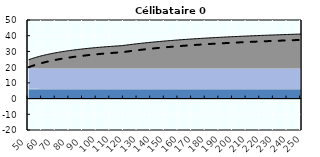
| Category | Coin fiscal moyen (somme des composantes) | Taux moyen d'imposition net en % du salaire brut |
|---|---|---|
| 50.0 | 24.742 | 19.963 |
| 51.0 | 25.045 | 20.286 |
| 52.0 | 25.337 | 20.596 |
| 53.0 | 25.618 | 20.895 |
| 54.0 | 25.889 | 21.183 |
| 55.0 | 26.149 | 21.46 |
| 56.0 | 26.401 | 21.727 |
| 57.0 | 26.643 | 21.985 |
| 58.0 | 26.878 | 22.234 |
| 59.0 | 27.104 | 22.475 |
| 60.0 | 27.323 | 22.708 |
| 61.0 | 27.534 | 22.933 |
| 62.0 | 27.739 | 23.15 |
| 63.0 | 27.937 | 23.361 |
| 64.0 | 28.129 | 23.565 |
| 65.0 | 28.315 | 23.763 |
| 66.0 | 28.496 | 23.955 |
| 67.0 | 28.671 | 24.142 |
| 68.0 | 28.841 | 24.322 |
| 69.0 | 29.006 | 24.498 |
| 70.0 | 29.166 | 24.668 |
| 71.0 | 29.322 | 24.834 |
| 72.0 | 29.473 | 24.995 |
| 73.0 | 29.621 | 25.152 |
| 74.0 | 29.764 | 25.304 |
| 75.0 | 29.904 | 25.452 |
| 76.0 | 30.039 | 25.597 |
| 77.0 | 30.172 | 25.738 |
| 78.0 | 30.301 | 25.875 |
| 79.0 | 30.426 | 26.008 |
| 80.0 | 30.549 | 26.139 |
| 81.0 | 30.668 | 26.266 |
| 82.0 | 30.785 | 26.39 |
| 83.0 | 30.899 | 26.511 |
| 84.0 | 31.01 | 26.629 |
| 85.0 | 31.118 | 26.744 |
| 86.0 | 31.224 | 26.857 |
| 87.0 | 31.328 | 26.967 |
| 88.0 | 31.429 | 27.074 |
| 89.0 | 31.528 | 27.18 |
| 90.0 | 31.624 | 27.282 |
| 91.0 | 31.719 | 27.383 |
| 92.0 | 31.811 | 27.481 |
| 93.0 | 31.902 | 27.578 |
| 94.0 | 31.99 | 27.672 |
| 95.0 | 32.077 | 27.764 |
| 96.0 | 32.162 | 27.854 |
| 97.0 | 32.245 | 27.943 |
| 98.0 | 32.327 | 28.029 |
| 99.0 | 32.406 | 28.114 |
| 100.0 | 32.485 | 28.197 |
| 101.0 | 32.561 | 28.279 |
| 102.0 | 32.636 | 28.359 |
| 103.0 | 32.71 | 28.437 |
| 104.0 | 32.782 | 28.514 |
| 105.0 | 32.853 | 28.589 |
| 106.0 | 32.923 | 28.663 |
| 107.0 | 32.991 | 28.736 |
| 108.0 | 33.058 | 28.807 |
| 109.0 | 33.124 | 28.877 |
| 110.0 | 33.189 | 28.946 |
| 111.0 | 33.252 | 29.013 |
| 112.0 | 33.314 | 29.08 |
| 113.0 | 33.375 | 29.145 |
| 114.0 | 33.435 | 29.209 |
| 115.0 | 33.495 | 29.271 |
| 116.0 | 33.553 | 29.333 |
| 117.0 | 33.61 | 29.394 |
| 118.0 | 33.666 | 29.453 |
| 119.0 | 33.744 | 29.537 |
| 120.0 | 33.861 | 29.661 |
| 121.0 | 33.975 | 29.783 |
| 122.0 | 34.088 | 29.902 |
| 123.0 | 34.199 | 30.02 |
| 124.0 | 34.308 | 30.136 |
| 125.0 | 34.415 | 30.25 |
| 126.0 | 34.521 | 30.363 |
| 127.0 | 34.625 | 30.473 |
| 128.0 | 34.727 | 30.582 |
| 129.0 | 34.828 | 30.689 |
| 130.0 | 34.927 | 30.795 |
| 131.0 | 35.024 | 30.898 |
| 132.0 | 35.121 | 31.001 |
| 133.0 | 35.215 | 31.101 |
| 134.0 | 35.309 | 31.201 |
| 135.0 | 35.401 | 31.299 |
| 136.0 | 35.491 | 31.395 |
| 137.0 | 35.58 | 31.49 |
| 138.0 | 35.668 | 31.583 |
| 139.0 | 35.755 | 31.676 |
| 140.0 | 35.841 | 31.766 |
| 141.0 | 35.925 | 31.856 |
| 142.0 | 36.008 | 31.944 |
| 143.0 | 36.09 | 32.031 |
| 144.0 | 36.171 | 32.117 |
| 145.0 | 36.25 | 32.202 |
| 146.0 | 36.329 | 32.286 |
| 147.0 | 36.406 | 32.368 |
| 148.0 | 36.483 | 32.449 |
| 149.0 | 36.558 | 32.53 |
| 150.0 | 36.632 | 32.609 |
| 151.0 | 36.706 | 32.687 |
| 152.0 | 36.778 | 32.764 |
| 153.0 | 36.85 | 32.84 |
| 154.0 | 36.92 | 32.915 |
| 155.0 | 36.99 | 32.989 |
| 156.0 | 37.059 | 33.062 |
| 157.0 | 37.127 | 33.134 |
| 158.0 | 37.194 | 33.206 |
| 159.0 | 37.26 | 33.276 |
| 160.0 | 37.325 | 33.346 |
| 161.0 | 37.39 | 33.414 |
| 162.0 | 37.454 | 33.482 |
| 163.0 | 37.517 | 33.549 |
| 164.0 | 37.579 | 33.615 |
| 165.0 | 37.64 | 33.681 |
| 166.0 | 37.701 | 33.745 |
| 167.0 | 37.761 | 33.809 |
| 168.0 | 37.82 | 33.872 |
| 169.0 | 37.879 | 33.934 |
| 170.0 | 37.937 | 33.996 |
| 171.0 | 37.994 | 34.057 |
| 172.0 | 38.051 | 34.117 |
| 173.0 | 38.107 | 34.176 |
| 174.0 | 38.162 | 34.235 |
| 175.0 | 38.216 | 34.293 |
| 176.0 | 38.27 | 34.351 |
| 177.0 | 38.324 | 34.407 |
| 178.0 | 38.377 | 34.463 |
| 179.0 | 38.429 | 34.519 |
| 180.0 | 38.48 | 34.574 |
| 181.0 | 38.531 | 34.628 |
| 182.0 | 38.582 | 34.682 |
| 183.0 | 38.632 | 34.735 |
| 184.0 | 38.681 | 34.787 |
| 185.0 | 38.73 | 34.839 |
| 186.0 | 38.778 | 34.891 |
| 187.0 | 38.826 | 34.942 |
| 188.0 | 38.874 | 34.992 |
| 189.0 | 38.92 | 35.042 |
| 190.0 | 38.967 | 35.091 |
| 191.0 | 39.012 | 35.14 |
| 192.0 | 39.058 | 35.188 |
| 193.0 | 39.103 | 35.236 |
| 194.0 | 39.147 | 35.283 |
| 195.0 | 39.191 | 35.33 |
| 196.0 | 39.235 | 35.376 |
| 197.0 | 39.278 | 35.422 |
| 198.0 | 39.32 | 35.467 |
| 199.0 | 39.363 | 35.512 |
| 200.0 | 39.404 | 35.556 |
| 201.0 | 39.446 | 35.6 |
| 202.0 | 39.487 | 35.644 |
| 203.0 | 39.527 | 35.687 |
| 204.0 | 39.567 | 35.73 |
| 205.0 | 39.607 | 35.772 |
| 206.0 | 39.647 | 35.814 |
| 207.0 | 39.686 | 35.856 |
| 208.0 | 39.724 | 35.897 |
| 209.0 | 39.762 | 35.937 |
| 210.0 | 39.8 | 35.978 |
| 211.0 | 39.838 | 36.018 |
| 212.0 | 39.875 | 36.057 |
| 213.0 | 39.912 | 36.096 |
| 214.0 | 39.948 | 36.135 |
| 215.0 | 39.984 | 36.173 |
| 216.0 | 40.02 | 36.212 |
| 217.0 | 40.056 | 36.249 |
| 218.0 | 40.091 | 36.287 |
| 219.0 | 40.126 | 36.324 |
| 220.0 | 40.16 | 36.36 |
| 221.0 | 40.194 | 36.397 |
| 222.0 | 40.228 | 36.433 |
| 223.0 | 40.262 | 36.469 |
| 224.0 | 40.295 | 36.504 |
| 225.0 | 40.328 | 36.539 |
| 226.0 | 40.361 | 36.574 |
| 227.0 | 40.393 | 36.608 |
| 228.0 | 40.426 | 36.643 |
| 229.0 | 40.457 | 36.676 |
| 230.0 | 40.489 | 36.71 |
| 231.0 | 40.52 | 36.743 |
| 232.0 | 40.551 | 36.776 |
| 233.0 | 40.582 | 36.809 |
| 234.0 | 40.613 | 36.841 |
| 235.0 | 40.643 | 36.874 |
| 236.0 | 40.673 | 36.906 |
| 237.0 | 40.703 | 36.937 |
| 238.0 | 40.732 | 36.968 |
| 239.0 | 40.761 | 37 |
| 240.0 | 40.79 | 37.03 |
| 241.0 | 40.819 | 37.061 |
| 242.0 | 40.848 | 37.091 |
| 243.0 | 40.876 | 37.121 |
| 244.0 | 40.904 | 37.151 |
| 245.0 | 40.932 | 37.181 |
| 246.0 | 40.959 | 37.21 |
| 247.0 | 40.987 | 37.239 |
| 248.0 | 41.014 | 37.268 |
| 249.0 | 41.041 | 37.297 |
| 250.0 | 41.067 | 37.325 |